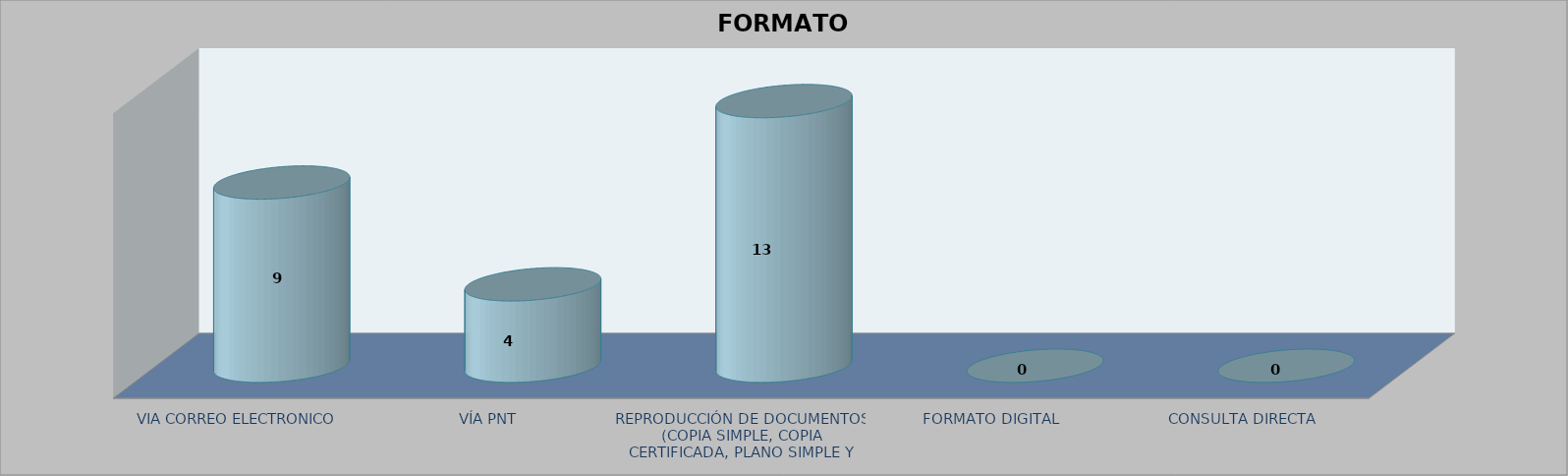
| Category |        FORMATO SOLICITADO | Series 1 | Series 2 |
|---|---|---|---|
| VIA CORREO ELECTRONICO |  |  | 9 |
| VÍA PNT |  |  | 4 |
| REPRODUCCIÓN DE DOCUMENTOS (COPIA SIMPLE, COPIA CERTIFICADA, PLANO SIMPLE Y PLANO CERTIFICADO) |  |  | 13 |
| FORMATO DIGITAL |  |  | 0 |
| CONSULTA DIRECTA |  |  | 0 |